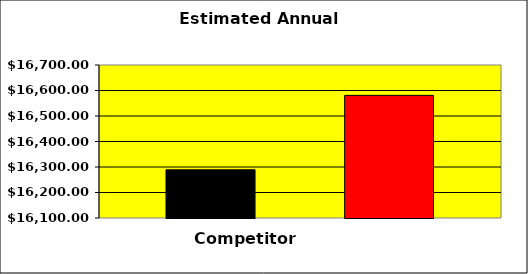
| Category | Series 0 | Series 1 | Series 2 |
|---|---|---|---|
| 0 | 16289 |  | 16580.856 |